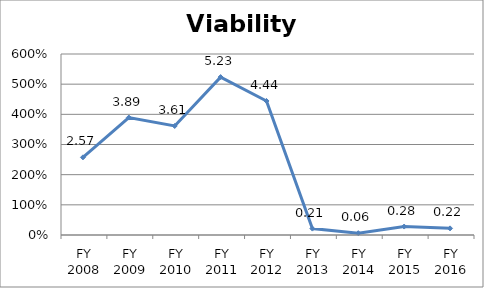
| Category | Viability ratio |
|---|---|
| FY 2016 | 0.22 |
| FY 2015 | 0.28 |
| FY 2014 | 0.061 |
| FY 2013 | 0.212 |
| FY 2012 | 4.443 |
| FY 2011 | 5.234 |
| FY 2010 | 3.614 |
| FY 2009 | 3.893 |
| FY 2008 | 2.574 |